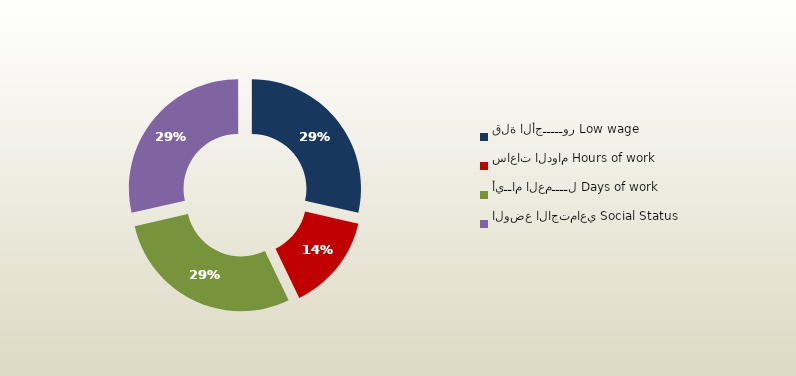
| Category | المجموع
Total |
|---|---|
| قلة الأجـــــور Low wage | 170 |
| ساعات الدوام Hours of work | 85 |
| أيــام العمــــل Days of work | 170 |
| الوضع الاجتماعي Social Status | 170 |